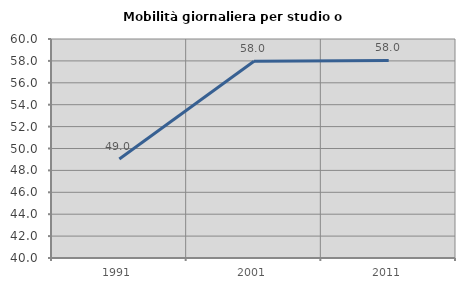
| Category | Mobilità giornaliera per studio o lavoro |
|---|---|
| 1991.0 | 49.041 |
| 2001.0 | 57.974 |
| 2011.0 | 58.042 |